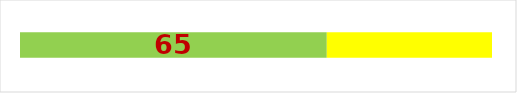
| Category | Series 0 | Series 1 |
|---|---|---|
| 0 | 65 | 35 |